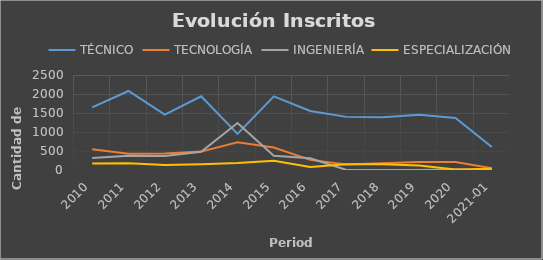
| Category | TÉCNICO | TECNOLOGÍA | INGENIERÍA | ESPECIALIZACIÓN |
|---|---|---|---|---|
| 2010 | 1649 | 546 | 317 | 169 |
| 2011 | 2079 | 429 | 377 | 175 |
| 2012 | 1458 | 434 | 367 | 134 |
| 2013 | 1940 | 484 | 481 | 152 |
| 2014 | 950 | 727 | 1236 | 183 |
| 2015 | 1939 | 593 | 376 | 243 |
| 2016 | 1554 | 266 | 310 | 82 |
| 2017 | 1398 | 145 | 1 | 150 |
| 2018 | 1385 | 179 | 3 | 150 |
| 2019 | 1457 | 208 | 3 | 116 |
| 2020 | 1370 | 210 | 16 | 15 |
| 2021-01 | 607 | 48 | 0 | 36 |